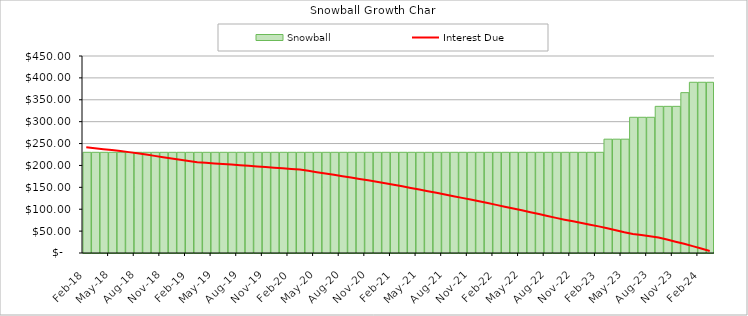
| Category | Snowball |
|---|---|
| 2018-02-01 | 230 |
| 2018-03-01 | 230 |
| 2018-04-01 | 230 |
| 2018-05-01 | 230 |
| 2018-06-01 | 230 |
| 2018-07-01 | 230 |
| 2018-08-01 | 230 |
| 2018-09-01 | 230 |
| 2018-10-01 | 230 |
| 2018-11-01 | 230 |
| 2018-12-01 | 230 |
| 2019-01-01 | 230 |
| 2019-02-01 | 230 |
| 2019-03-01 | 230 |
| 2019-04-01 | 230 |
| 2019-05-01 | 230 |
| 2019-06-01 | 230 |
| 2019-07-01 | 230 |
| 2019-08-01 | 230 |
| 2019-09-01 | 230 |
| 2019-10-01 | 230 |
| 2019-11-01 | 230 |
| 2019-12-01 | 230 |
| 2020-01-01 | 230 |
| 2020-02-01 | 230 |
| 2020-03-01 | 230 |
| 2020-04-01 | 230 |
| 2020-05-01 | 230 |
| 2020-06-01 | 230 |
| 2020-07-01 | 230 |
| 2020-08-01 | 230 |
| 2020-09-01 | 230 |
| 2020-10-01 | 230 |
| 2020-11-01 | 230 |
| 2020-12-01 | 230 |
| 2021-01-01 | 230 |
| 2021-02-01 | 230 |
| 2021-03-01 | 230 |
| 2021-04-01 | 230 |
| 2021-05-01 | 230 |
| 2021-06-01 | 230 |
| 2021-07-01 | 230 |
| 2021-08-01 | 230 |
| 2021-09-01 | 230 |
| 2021-10-01 | 230 |
| 2021-11-01 | 230 |
| 2021-12-01 | 230 |
| 2022-01-01 | 230 |
| 2022-02-01 | 230 |
| 2022-03-01 | 230 |
| 2022-04-01 | 230 |
| 2022-05-01 | 230 |
| 2022-06-01 | 230 |
| 2022-07-01 | 230 |
| 2022-08-01 | 230 |
| 2022-09-01 | 230 |
| 2022-10-01 | 230 |
| 2022-11-01 | 230 |
| 2022-12-01 | 230 |
| 2023-01-01 | 230 |
| 2023-02-01 | 230 |
| 2023-03-01 | 260 |
| 2023-04-01 | 260 |
| 2023-05-01 | 260 |
| 2023-06-01 | 310 |
| 2023-07-01 | 310 |
| 2023-08-01 | 310 |
| 2023-09-01 | 335 |
| 2023-10-01 | 335 |
| 2023-11-01 | 335 |
| 2023-12-01 | 366.31 |
| 2024-01-01 | 390 |
| 2024-02-01 | 390 |
| 2024-03-01 | 390 |
| #N/A | 0 |
| #N/A | 0 |
| #N/A | 0 |
| #N/A | 0 |
| #N/A | 0 |
| #N/A | 0 |
| #N/A | 0 |
| #N/A | 0 |
| #N/A | 0 |
| #N/A | 0 |
| #N/A | 0 |
| #N/A | 0 |
| #N/A | 0 |
| #N/A | 0 |
| #N/A | 0 |
| #N/A | 0 |
| #N/A | 0 |
| #N/A | 0 |
| #N/A | 0 |
| #N/A | 0 |
| #N/A | 0 |
| #N/A | 0 |
| #N/A | 0 |
| #N/A | 0 |
| #N/A | 0 |
| #N/A | 0 |
| #N/A | 0 |
| #N/A | 0 |
| #N/A | 0 |
| #N/A | 0 |
| #N/A | 0 |
| #N/A | 0 |
| #N/A | 0 |
| #N/A | 0 |
| #N/A | 0 |
| #N/A | 0 |
| #N/A | 0 |
| #N/A | 0 |
| #N/A | 0 |
| #N/A | 0 |
| #N/A | 0 |
| #N/A | 0 |
| #N/A | 0 |
| #N/A | 0 |
| #N/A | 0 |
| #N/A | 0 |
| #N/A | 0 |
| #N/A | 0 |
| #N/A | 0 |
| #N/A | 0 |
| #N/A | 0 |
| #N/A | 0 |
| #N/A | 0 |
| #N/A | 0 |
| #N/A | 0 |
| #N/A | 0 |
| #N/A | 0 |
| #N/A | 0 |
| #N/A | 0 |
| #N/A | 0 |
| #N/A | 0 |
| #N/A | 0 |
| #N/A | 0 |
| #N/A | 0 |
| #N/A | 0 |
| #N/A | 0 |
| #N/A | 0 |
| #N/A | 0 |
| #N/A | 0 |
| #N/A | 0 |
| #N/A | 0 |
| #N/A | 0 |
| #N/A | 0 |
| #N/A | 0 |
| #N/A | 0 |
| #N/A | 0 |
| #N/A | 0 |
| #N/A | 0 |
| #N/A | 0 |
| #N/A | 0 |
| #N/A | 0 |
| #N/A | 0 |
| #N/A | 0 |
| #N/A | 0 |
| #N/A | 0 |
| #N/A | 0 |
| #N/A | 0 |
| #N/A | 0 |
| #N/A | 0 |
| #N/A | 0 |
| #N/A | 0 |
| #N/A | 0 |
| #N/A | 0 |
| #N/A | 0 |
| #N/A | 0 |
| #N/A | 0 |
| #N/A | 0 |
| #N/A | 0 |
| #N/A | 0 |
| #N/A | 0 |
| #N/A | 0 |
| #N/A | 0 |
| #N/A | 0 |
| #N/A | 0 |
| #N/A | 0 |
| #N/A | 0 |
| #N/A | 0 |
| #N/A | 0 |
| #N/A | 0 |
| #N/A | 0 |
| #N/A | 0 |
| #N/A | 0 |
| #N/A | 0 |
| #N/A | 0 |
| #N/A | 0 |
| #N/A | 0 |
| #N/A | 0 |
| #N/A | 0 |
| #N/A | 0 |
| #N/A | 0 |
| #N/A | 0 |
| #N/A | 0 |
| #N/A | 0 |
| #N/A | 0 |
| #N/A | 0 |
| #N/A | 0 |
| #N/A | 0 |
| #N/A | 0 |
| #N/A | 0 |
| #N/A | 0 |
| #N/A | 0 |
| #N/A | 0 |
| #N/A | 0 |
| #N/A | 0 |
| #N/A | 0 |
| #N/A | 0 |
| #N/A | 0 |
| #N/A | 0 |
| #N/A | 0 |
| #N/A | 0 |
| #N/A | 0 |
| #N/A | 0 |
| #N/A | 0 |
| #N/A | 0 |
| #N/A | 0 |
| #N/A | 0 |
| #N/A | 0 |
| #N/A | 0 |
| #N/A | 0 |
| #N/A | 0 |
| #N/A | 0 |
| #N/A | 0 |
| #N/A | 0 |
| #N/A | 0 |
| #N/A | 0 |
| #N/A | 0 |
| #N/A | 0 |
| #N/A | 0 |
| #N/A | 0 |
| #N/A | 0 |
| #N/A | 0 |
| #N/A | 0 |
| #N/A | 0 |
| #N/A | 0 |
| #N/A | 0 |
| #N/A | 0 |
| #N/A | 0 |
| #N/A | 0 |
| #N/A | 0 |
| #N/A | 0 |
| #N/A | 0 |
| #N/A | 0 |
| #N/A | 0 |
| #N/A | 0 |
| #N/A | 0 |
| #N/A | 0 |
| #N/A | 0 |
| #N/A | 0 |
| #N/A | 0 |
| #N/A | 0 |
| #N/A | 0 |
| #N/A | 0 |
| #N/A | 0 |
| #N/A | 0 |
| #N/A | 0 |
| #N/A | 0 |
| #N/A | 0 |
| #N/A | 0 |
| #N/A | 0 |
| #N/A | 0 |
| #N/A | 0 |
| #N/A | 0 |
| #N/A | 0 |
| #N/A | 0 |
| #N/A | 0 |
| #N/A | 0 |
| #N/A | 0 |
| #N/A | 0 |
| #N/A | 0 |
| #N/A | 0 |
| #N/A | 0 |
| #N/A | 0 |
| #N/A | 0 |
| #N/A | 0 |
| #N/A | 0 |
| #N/A | 0 |
| #N/A | 0 |
| #N/A | 0 |
| #N/A | 0 |
| #N/A | 0 |
| #N/A | 0 |
| #N/A | 0 |
| #N/A | 0 |
| #N/A | 0 |
| #N/A | 0 |
| #N/A | 0 |
| #N/A | 0 |
| #N/A | 0 |
| #N/A | 0 |
| #N/A | 0 |
| #N/A | 0 |
| #N/A | 0 |
| #N/A | 0 |
| #N/A | 0 |
| #N/A | 0 |
| #N/A | 0 |
| #N/A | 0 |
| #N/A | 0 |
| #N/A | 0 |
| #N/A | 0 |
| #N/A | 0 |
| #N/A | 0 |
| #N/A | 0 |
| #N/A | 0 |
| #N/A | 0 |
| #N/A | 0 |
| #N/A | 0 |
| #N/A | 0 |
| #N/A | 0 |
| #N/A | 0 |
| #N/A | 0 |
| #N/A | 0 |
| #N/A | 0 |
| #N/A | 0 |
| #N/A | 0 |
| #N/A | 0 |
| #N/A | 0 |
| #N/A | 0 |
| #N/A | 0 |
| #N/A | 0 |
| #N/A | 0 |
| #N/A | 0 |
| #N/A | 0 |
| #N/A | 0 |
| #N/A | 0 |
| #N/A | 0 |
| #N/A | 0 |
| #N/A | 0 |
| #N/A | 0 |
| #N/A | 0 |
| #N/A | 0 |
| #N/A | 0 |
| #N/A | 0 |
| #N/A | 0 |
| #N/A | 0 |
| #N/A | 0 |
| #N/A | 0 |
| #N/A | 0 |
| #N/A | 0 |
| #N/A | 0 |
| #N/A | 0 |
| #N/A | 0 |
| #N/A | 0 |
| #N/A | 0 |
| #N/A | 0 |
| #N/A | 0 |
| #N/A | 0 |
| #N/A | 0 |
| #N/A | 0 |
| #N/A | 0 |
| #N/A | 0 |
| #N/A | 0 |
| #N/A | 0 |
| #N/A | 0 |
| #N/A | 0 |
| #N/A | 0 |